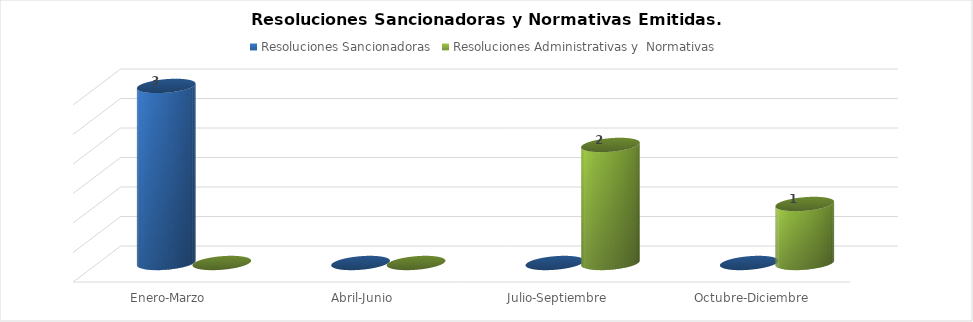
| Category | Resoluciones Sancionadoras | Resoluciones Administrativas y  Normativas |
|---|---|---|
| Enero-Marzo | 3 | 0 |
| Abril-Junio | 0 | 0 |
| Julio-Septiembre | 0 | 2 |
| Octubre-Diciembre | 0 | 1 |